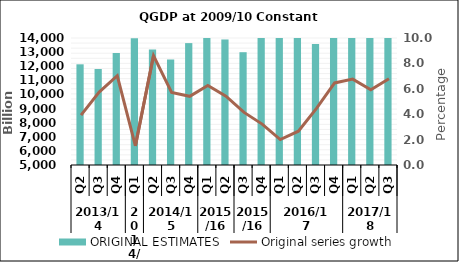
| Category | ORIGINAL ESTIMATES |
|---|---|
| 0 | 12135.193 |
| 1 | 11802.057 |
| 2 | 12938.121 |
| 3 | 13983.681 |
| 4 | 13180.308 |
| 5 | 12476.938 |
| 6 | 13637.958 |
| 7 | 14860.302 |
| 8 | 13895.256 |
| 9 | 12993.52 |
| 10 | 14077.071 |
| 11 | 15158.268 |
| 12 | 14264.766 |
| 13 | 13573.258 |
| 14 | 14986.435 |
| 15 | 16183.198 |
| 16 | 15109.453 |
| 17 | 14495.693 |